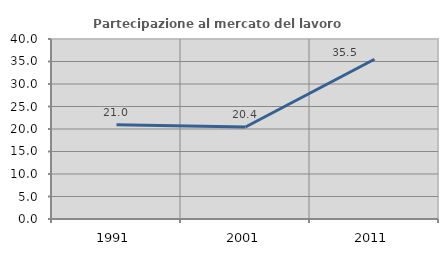
| Category | Partecipazione al mercato del lavoro  femminile |
|---|---|
| 1991.0 | 20.952 |
| 2001.0 | 20.442 |
| 2011.0 | 35.503 |